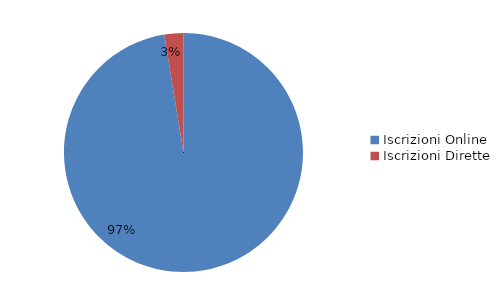
| Category | Series 0 |
|---|---|
| Iscrizioni Online | 114205 |
| Iscrizioni Dirette | 3023 |